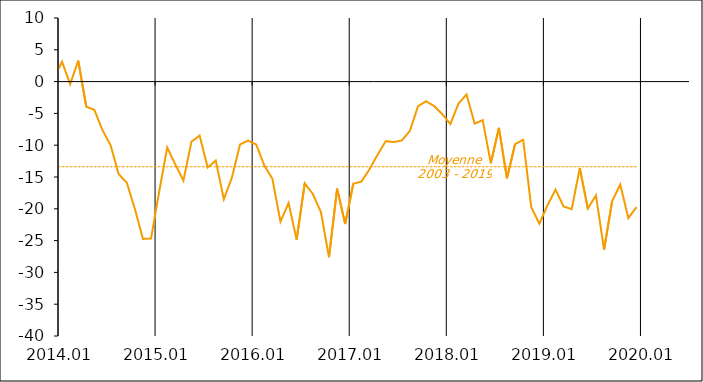
| Category | Series 1 | Moyenne
2003 - 2019 |
|---|---|---|
| 2003-01-20 | -13 | -13.387 |
| 2003-02-20 | -26 | -13.387 |
| 2003-03-20 | -28 | -13.387 |
| 2003-04-20 | -14 | -13.387 |
| 2003-05-20 | -6 | -13.387 |
| 2003-06-20 | -11 | -13.387 |
| 2003-07-20 | -6 | -13.387 |
| 2003-08-20 | -7 | -13.387 |
| 2003-09-20 | -3 | -13.387 |
| 2003-10-20 | -8 | -13.387 |
| 2003-11-20 | 3 | -13.387 |
| 2003-12-20 | -4 | -13.387 |
| 2004-01-20 | -2 | -13.387 |
| 2004-02-20 | 2 | -13.387 |
| 2004-03-20 | -2 | -13.387 |
| 2004-04-20 | -4 | -13.387 |
| 2004-05-20 | -7 | -13.387 |
| 2004-06-20 | 0 | -13.387 |
| 2004-07-20 | -6 | -13.387 |
| 2004-08-20 | -3 | -13.387 |
| 2004-09-20 | -5 | -13.387 |
| 2004-10-20 | -14 | -13.387 |
| 2004-11-20 | -11 | -13.387 |
| 2004-12-20 | -5 | -13.387 |
| 2005-01-20 | -12 | -13.387 |
| 2005-02-20 | -8 | -13.387 |
| 2005-03-20 | -5 | -13.387 |
| 2005-04-20 | -14 | -13.387 |
| 2005-05-20 | -15 | -13.387 |
| 2005-06-20 | -17 | -13.387 |
| 2005-07-20 | -21 | -13.387 |
| 2005-08-20 | -18 | -13.387 |
| 2005-09-20 | -31 | -13.387 |
| 2005-10-20 | -17 | -13.387 |
| 2005-11-20 | -13 | -13.387 |
| 2005-12-20 | -11 | -13.387 |
| 2006-01-20 | -11 | -13.387 |
| 2006-02-20 | -15 | -13.387 |
| 2006-03-20 | -13 | -13.387 |
| 2006-04-20 | -15 | -13.387 |
| 2006-05-20 | -16 | -13.387 |
| 2006-06-20 | -10 | -13.387 |
| 2006-07-20 | -6 | -13.387 |
| 2006-08-20 | -12 | -13.387 |
| 2006-09-20 | -9 | -13.387 |
| 2006-10-20 | -8 | -13.387 |
| 2006-11-20 | -5 | -13.387 |
| 2006-12-20 | -15 | -13.387 |
| 2007-01-20 | -13 | -13.387 |
| 2007-02-20 | -8 | -13.387 |
| 2007-03-20 | -9 | -13.387 |
| 2007-04-20 | -4 | -13.387 |
| 2007-05-20 | -1 | -13.387 |
| 2007-06-20 | -4 | -13.387 |
| 2007-07-20 | -6 | -13.387 |
| 2007-08-20 | -16 | -13.387 |
| 2007-09-20 | -12 | -13.387 |
| 2007-10-20 | -11 | -13.387 |
| 2007-11-20 | -31 | -13.387 |
| 2007-12-20 | -23 | -13.387 |
| 2008-01-20 | -26 | -13.387 |
| 2008-02-20 | -23 | -13.387 |
| 2008-03-20 | -19 | -13.387 |
| 2008-04-20 | -26 | -13.387 |
| 2008-05-20 | -33 | -13.387 |
| 2008-06-20 | -37 | -13.387 |
| 2008-07-20 | -35 | -13.387 |
| 2008-08-20 | -24 | -13.387 |
| 2008-09-20 | -22 | -13.387 |
| 2008-10-20 | -27 | -13.387 |
| 2008-11-20 | -20 | -13.387 |
| 2008-12-20 | -26 | -13.387 |
| 2009-01-20 | -19 | -13.387 |
| 2009-02-20 | -29 | -13.387 |
| 2009-03-20 | -24 | -13.387 |
| 2009-04-20 | -21 | -13.387 |
| 2009-05-20 | -14 | -13.387 |
| 2009-06-20 | -13 | -13.387 |
| 2009-07-20 | -12 | -13.387 |
| 2009-08-20 | -4 | -13.387 |
| 2009-09-20 | -5 | -13.387 |
| 2009-10-20 | -9 | -13.387 |
| 2009-11-20 | 0 | -13.387 |
| 2009-12-20 | -7 | -13.387 |
| 2010-01-20 | -16 | -13.387 |
| 2010-02-20 | -8 | -13.387 |
| 2010-03-20 | -5 | -13.387 |
| 2010-04-20 | -3 | -13.387 |
| 2010-05-20 | -19 | -13.387 |
| 2010-06-20 | -14 | -13.387 |
| 2010-07-20 | -4 | -13.387 |
| 2010-08-20 | -8 | -13.387 |
| 2010-09-20 | -12 | -13.387 |
| 2010-10-20 | -14 | -13.387 |
| 2010-11-20 | -9 | -13.387 |
| 2010-12-20 | -10 | -13.387 |
| 2011-01-20 | -18 | -13.387 |
| 2011-02-20 | -13 | -13.387 |
| 2011-03-20 | -16 | -13.387 |
| 2011-04-20 | -16 | -13.387 |
| 2011-05-20 | -8 | -13.387 |
| 2011-06-20 | -13 | -13.387 |
| 2011-07-20 | -18 | -13.387 |
| 2011-08-20 | -17 | -13.387 |
| 2011-09-20 | -14 | -13.387 |
| 2011-10-20 | -9 | -13.387 |
| 2011-11-20 | -22 | -13.387 |
| 2011-12-20 | -9 | -13.387 |
| 2012-01-20 | -27 | -13.387 |
| 2012-02-20 | -29 | -13.387 |
| 2012-03-20 | -14 | -13.387 |
| 2012-04-20 | -16 | -13.387 |
| 2012-05-20 | -12 | -13.387 |
| 2012-06-20 | -14 | -13.387 |
| 2012-07-20 | -8 | -13.387 |
| 2012-08-20 | -12 | -13.387 |
| 2012-09-20 | -11 | -13.387 |
| 2012-10-20 | -18 | -13.387 |
| 2012-11-20 | -30.798 | -13.387 |
| 2012-12-20 | -24.498 | -13.387 |
| 2013-01-20 | -18.26 | -13.387 |
| 2013-02-20 | -15.723 | -13.387 |
| 2013-03-20 | -26.029 | -13.387 |
| 2013-04-20 | -23.475 | -13.387 |
| 2013-05-20 | -19.78 | -13.387 |
| 2013-06-20 | -20.36 | -13.387 |
| 2013-07-20 | -13.172 | -13.387 |
| 2013-08-20 | -10.669 | -13.387 |
| 2013-09-20 | -2.865 | -13.387 |
| 2013-10-20 | -1.885 | -13.387 |
| 2013-11-20 | 0.301 | -13.387 |
| 2013-12-20 | 0.563 | -13.387 |
| 2014-01-20 | 3.126 | -13.387 |
| 2014-02-20 | -0.396 | -13.387 |
| 2014-03-20 | 3.306 | -13.387 |
| 2014-04-20 | -3.952 | -13.387 |
| 2014-05-20 | -4.448 | -13.387 |
| 2014-06-20 | -7.64 | -13.387 |
| 2014-07-20 | -10.008 | -13.387 |
| 2014-08-20 | -14.556 | -13.387 |
| 2014-09-20 | -15.876 | -13.387 |
| 2014-10-20 | -20.004 | -13.387 |
| 2014-11-20 | -24.734 | -13.387 |
| 2014-12-20 | -24.673 | -13.387 |
| 2015-01-20 | -17.353 | -13.387 |
| 2015-02-20 | -10.357 | -13.387 |
| 2015-03-20 | -13.009 | -13.387 |
| 2015-04-20 | -15.559 | -13.387 |
| 2015-05-20 | -9.443 | -13.387 |
| 2015-06-20 | -8.481 | -13.387 |
| 2015-07-20 | -13.509 | -13.387 |
| 2015-08-20 | -12.414 | -13.387 |
| 2015-09-20 | -18.493 | -13.387 |
| 2015-10-20 | -15.086 | -13.387 |
| 2015-11-20 | -9.88 | -13.387 |
| 2015-12-20 | -9.275 | -13.387 |
| 2016-01-20 | -9.891 | -13.387 |
| 2016-02-20 | -13.191 | -13.387 |
| 2016-03-20 | -15.275 | -13.387 |
| 2016-04-20 | -22.018 | -13.387 |
| 2016-05-20 | -19.091 | -13.387 |
| 2016-06-20 | -24.851 | -13.387 |
| 2016-07-20 | -15.987 | -13.387 |
| 2016-08-20 | -17.674 | -13.387 |
| 2016-09-20 | -20.522 | -13.387 |
| 2016-10-20 | -27.61 | -13.387 |
| 2016-11-20 | -16.826 | -13.387 |
| 2016-12-20 | -22.381 | -13.387 |
| 2017-01-20 | -16.053 | -13.387 |
| 2017-02-20 | -15.728 | -13.387 |
| 2017-03-20 | -13.787 | -13.387 |
| 2017-04-20 | -11.515 | -13.387 |
| 2017-05-20 | -9.373 | -13.387 |
| 2017-06-20 | -9.497 | -13.387 |
| 2017-07-20 | -9.253 | -13.387 |
| 2017-08-20 | -7.748 | -13.387 |
| 2017-09-20 | -3.879 | -13.387 |
| 2017-10-20 | -3.085 | -13.387 |
| 2017-11-20 | -3.846 | -13.387 |
| 2017-12-20 | -5.114 | -13.387 |
| 2018-01-20 | -6.673 | -13.387 |
| 2018-02-20 | -3.474 | -13.387 |
| 2018-03-20 | -2.015 | -13.387 |
| 2018-04-20 | -6.609 | -13.387 |
| 2018-05-20 | -6.054 | -13.387 |
| 2018-06-20 | -12.83 | -13.387 |
| 2018-07-20 | -7.275 | -13.387 |
| 2018-08-20 | -15.206 | -13.387 |
| 2018-09-20 | -9.829 | -13.387 |
| 2018-10-20 | -9.148 | -13.387 |
| 2018-11-20 | -19.75 | -13.387 |
| 2018-12-20 | -22.334 | -13.387 |
| 2019-01-20 | -19.469 | -13.387 |
| 2019-02-20 | -16.997 | -13.387 |
| 2019-03-20 | -19.643 | -13.387 |
| 2019-04-20 | -20.053 | -13.387 |
| 2019-05-20 | -13.601 | -13.387 |
| 2019-06-20 | -19.968 | -13.387 |
| 2019-07-20 | -17.88 | -13.387 |
| 2019-08-20 | -26.431 | -13.387 |
| 2019-09-20 | -18.783 | -13.387 |
| 2019-10-20 | -16.182 | -13.387 |
| 2019-11-20 | -21.46 | -13.387 |
| 2019-12-20 | -19.746 | -13.387 |